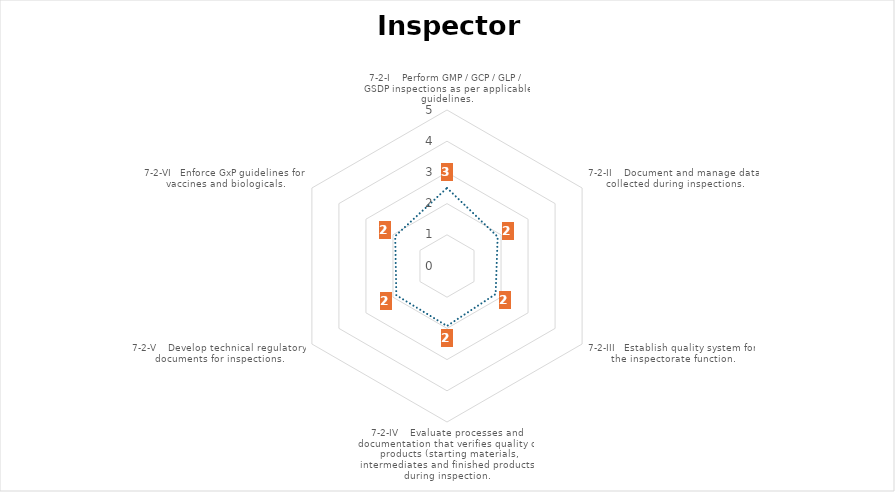
| Category | Average |
|---|---|
| 7-2-I    Perform GMP / GCP / GLP / GSDP inspections as per applicable guidelines. | 2.5 |
| 7-2-II    Document and manage data collected during inspections. | 1.875 |
| 7-2-III   Establish quality system for the inspectorate function. | 1.8 |
| 7-2-IV    Evaluate processes and documentation that verifies quality of products (starting materials, intermediates and finished products) during inspection. | 1.923 |
| 7-2-V    Develop technical regulatory documents for inspections. | 1.875 |
| 7-2-VI   Enforce GxP guidelines for vaccines and biologicals. | 1.917 |